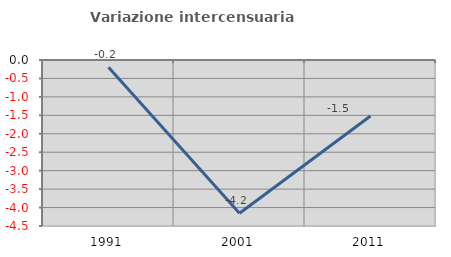
| Category | Variazione intercensuaria annua |
|---|---|
| 1991.0 | -0.194 |
| 2001.0 | -4.156 |
| 2011.0 | -1.516 |